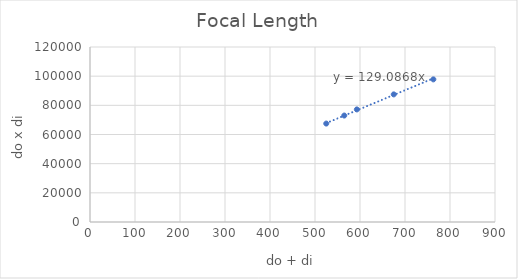
| Category | do x di |
|---|---|
| 565.0 | 73000 |
| 525.0 | 67500 |
| 593.0 | 77200 |
| 675.0 | 87500 |
| 763.0 | 97800 |